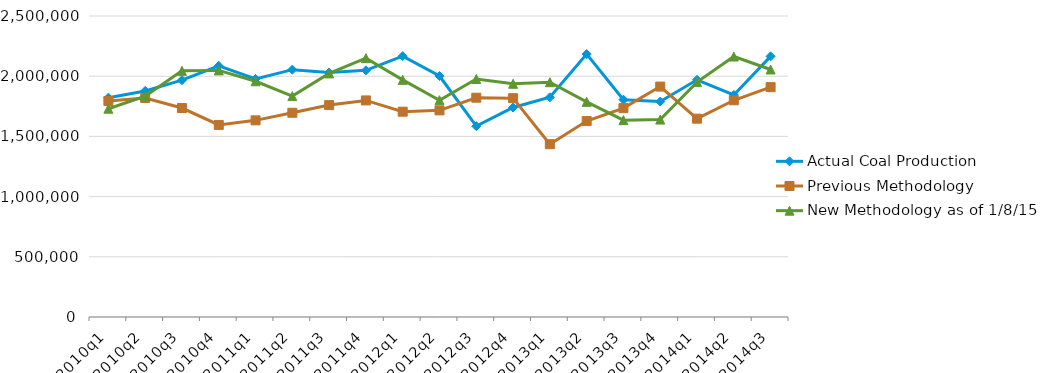
| Category | Actual Coal Production | Previous Methodology | New Methodology as of 1/8/15 |
|---|---|---|---|
| 2010q1 | 1821790 | 1793825 | 1729916 |
| 2010q2 | 1877782 | 1819121 | 1834139 |
| 2010q3 | 1967073 | 1735727 | 2044675 |
| 2010q4 | 2085632 | 1595318 | 2048161 |
| 2011q1 | 1977231 | 1633306 | 1957729 |
| 2011q2 | 2054356 | 1696337 | 1834882 |
| 2011q3 | 2030773 | 1759943 | 2023209 |
| 2011q4 | 2048582 | 1798844 | 2149739 |
| 2012q1 | 2167050 | 1705231 | 1969686 |
| 2012q2 | 2001517 | 1716216 | 1800568 |
| 2012q3 | 1584919 | 1821324 | 1976996 |
| 2012q4 | 1739790 | 1817438 | 1937085 |
| 2013q1 | 1824891 | 1435245 | 1950109 |
| 2013q2 | 2183675 | 1627302 | 1787008 |
| 2013q3 | 1805051 | 1734958 | 1634799 |
| 2013q4 | 1789105 | 1913873 | 1639766 |
| 2014q1 | 1970112 | 1647266 | 1951023 |
| 2014q2 | 1843797 | 1799981 | 2163341 |
| 2014q3 | 2164797 | 1909364 | 2055861 |